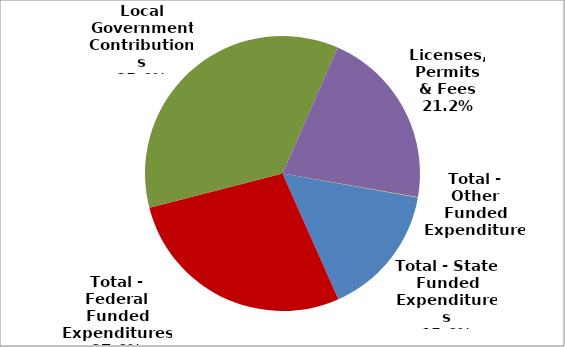
| Category | Series 0 |
|---|---|
| Total - State Funded Expenditures | 500333 |
| Total - Federal Funded Expenditures | 888933 |
| Local Government Contributions | 1144076 |
| Licenses, Permits & Fees | 681809 |
| Total - Other Funded Expenditures | 149 |